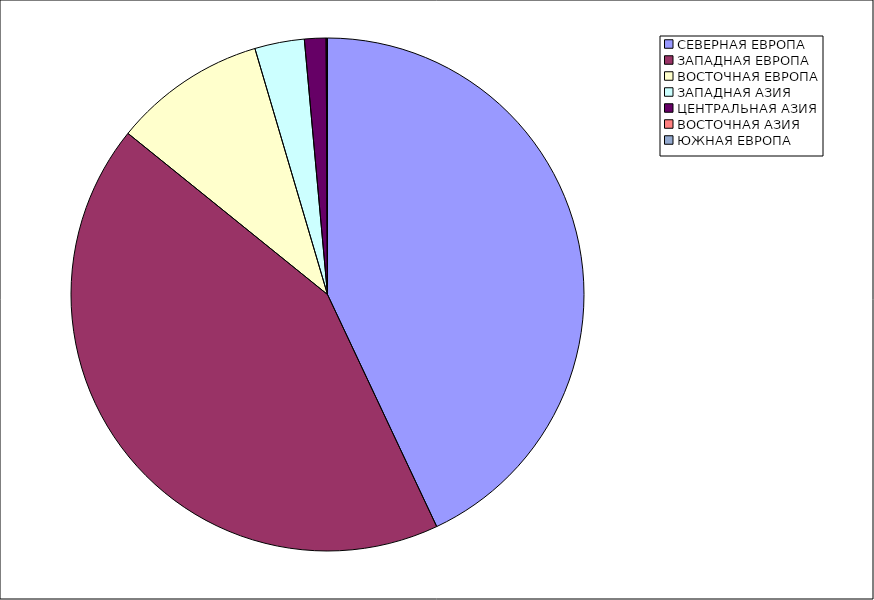
| Category | Оборот |
|---|---|
| СЕВЕРНАЯ ЕВРОПА | 42.997 |
| ЗАПАДНАЯ ЕВРОПА | 42.813 |
| ВОСТОЧНАЯ ЕВРОПА | 9.623 |
| ЗАПАДНАЯ АЗИЯ | 3.125 |
| ЦЕНТРАЛЬНАЯ АЗИЯ | 1.356 |
| ВОСТОЧНАЯ АЗИЯ | 0.056 |
| ЮЖНАЯ ЕВРОПА | 0.03 |